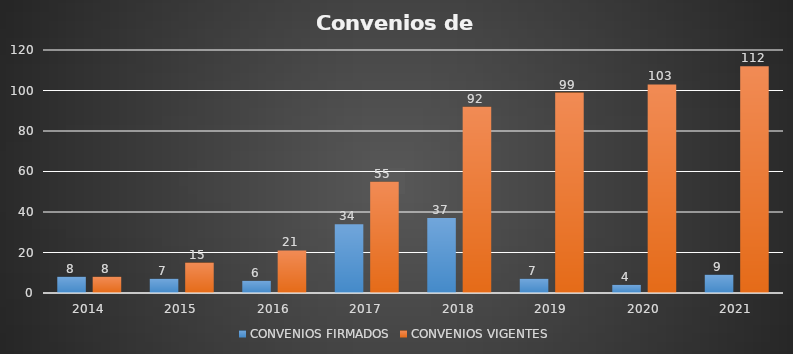
| Category | CONVENIOS FIRMADOS | CONVENIOS VIGENTES |
|---|---|---|
| 2014.0 | 8 | 8 |
| 2015.0 | 7 | 15 |
| 2016.0 | 6 | 21 |
| 2017.0 | 34 | 55 |
| 2018.0 | 37 | 92 |
| 2019.0 | 7 | 99 |
| 2020.0 | 4 | 103 |
| 2021.0 | 9 | 112 |